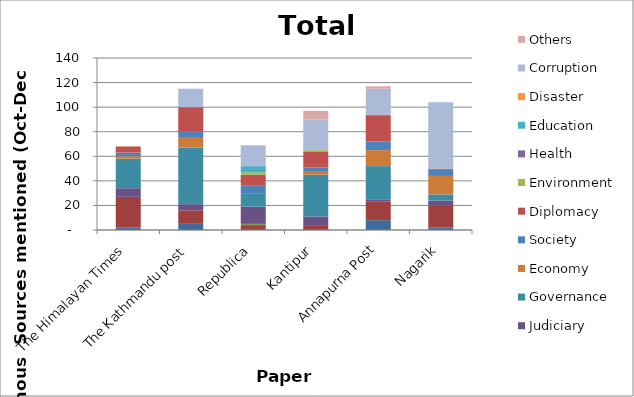
| Category | Security | Politics | Demonstration | Judiciary | Governance | Economy | Society | Diplomacy | Environment | Health | Education | Disaster | Corruption | Others |
|---|---|---|---|---|---|---|---|---|---|---|---|---|---|---|
| The Himalayan Times | 2 | 25 | 0 | 7 | 24 | 2 | 3 | 5 | 0 | 0 | 0 | 0 | 0 | 0 |
| The Kathmandu post | 5 | 11 | 0 | 5 | 46 | 8 | 5 | 20 | 0 | 0 | 0 | 0 | 15 | 0 |
| Republica | 0 | 4 | 1 | 14 | 11 | 0 | 6 | 9 | 2 | 0 | 5 | 0 | 17 | 0 |
| Kantipur | 0 | 4 | 0 | 7 | 34 | 3 | 3 | 13 | 1 | 0 | 0 | 0 | 25 | 7 |
| Annapurna Post | 8 | 15 | 0 | 2 | 27 | 13 | 7 | 21 | 0 | 1 | 0 | 0 | 21 | 2 |
| Nagarik | 2 | 18 | 0 | 4 | 5 | 15 | 5 | 1 | 0 | 0 | 0 | 0 | 54 | 0 |